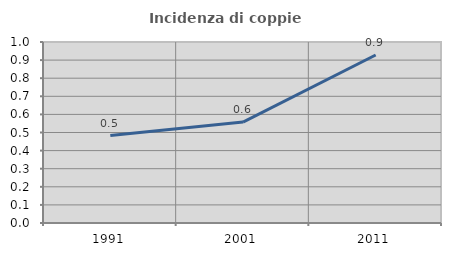
| Category | Incidenza di coppie miste |
|---|---|
| 1991.0 | 0.483 |
| 2001.0 | 0.558 |
| 2011.0 | 0.928 |